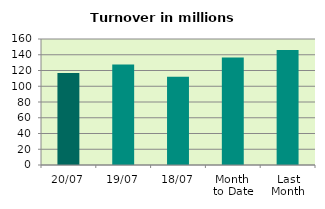
| Category | Series 0 |
|---|---|
| 20/07 | 116.946 |
| 19/07 | 127.523 |
| 18/07 | 112.113 |
| Month 
to Date | 136.551 |
| Last
Month | 145.879 |